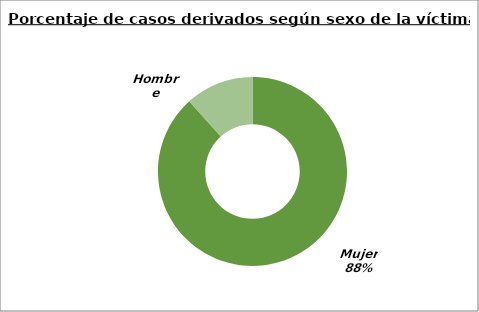
| Category | Series 0 |
|---|---|
| Mujer  | 831 |
| Hombre | 110 |